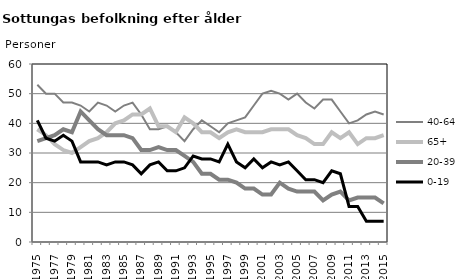
| Category | 40-64 | 65+ | 20-39 | 0-19 |
|---|---|---|---|---|
| 1975.0 | 53 | 38 | 34 | 41 |
| 1976.0 | 50 | 36 | 35 | 35 |
| 1977.0 | 50 | 33 | 36 | 34 |
| 1978.0 | 47 | 31 | 38 | 36 |
| 1979.0 | 47 | 30 | 37 | 34 |
| 1980.0 | 46 | 32 | 44 | 27 |
| 1981.0 | 44 | 34 | 41 | 27 |
| 1982.0 | 47 | 35 | 38 | 27 |
| 1983.0 | 46 | 37 | 36 | 26 |
| 1984.0 | 44 | 40 | 36 | 27 |
| 1985.0 | 46 | 41 | 36 | 27 |
| 1986.0 | 47 | 43 | 35 | 26 |
| 1987.0 | 43 | 43 | 31 | 23 |
| 1988.0 | 38 | 45 | 31 | 26 |
| 1989.0 | 38 | 39 | 32 | 27 |
| 1990.0 | 39 | 39 | 31 | 24 |
| 1991.0 | 37 | 37 | 31 | 24 |
| 1992.0 | 34 | 42 | 29 | 25 |
| 1993.0 | 38 | 40 | 27 | 29 |
| 1994.0 | 41 | 37 | 23 | 28 |
| 1995.0 | 39 | 37 | 23 | 28 |
| 1996.0 | 37 | 35 | 21 | 27 |
| 1997.0 | 40 | 37 | 21 | 33 |
| 1998.0 | 41 | 38 | 20 | 27 |
| 1999.0 | 42 | 37 | 18 | 25 |
| 2000.0 | 46 | 37 | 18 | 28 |
| 2001.0 | 50 | 37 | 16 | 25 |
| 2002.0 | 51 | 38 | 16 | 27 |
| 2003.0 | 50 | 38 | 20 | 26 |
| 2004.0 | 48 | 38 | 18 | 27 |
| 2005.0 | 50 | 36 | 17 | 24 |
| 2006.0 | 47 | 35 | 17 | 21 |
| 2007.0 | 45 | 33 | 17 | 21 |
| 2008.0 | 48 | 33 | 14 | 20 |
| 2009.0 | 48 | 37 | 16 | 24 |
| 2010.0 | 44 | 35 | 17 | 23 |
| 2011.0 | 40 | 37 | 14 | 12 |
| 2012.0 | 41 | 33 | 15 | 12 |
| 2013.0 | 43 | 35 | 15 | 7 |
| 2014.0 | 44 | 35 | 15 | 7 |
| 2015.0 | 43 | 36 | 13 | 7 |